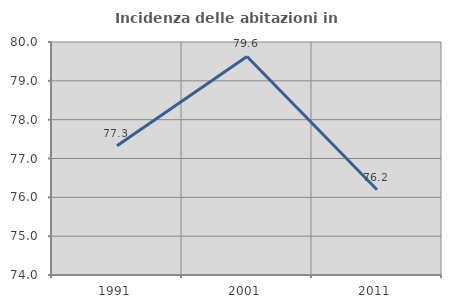
| Category | Incidenza delle abitazioni in proprietà  |
|---|---|
| 1991.0 | 77.33 |
| 2001.0 | 79.628 |
| 2011.0 | 76.194 |